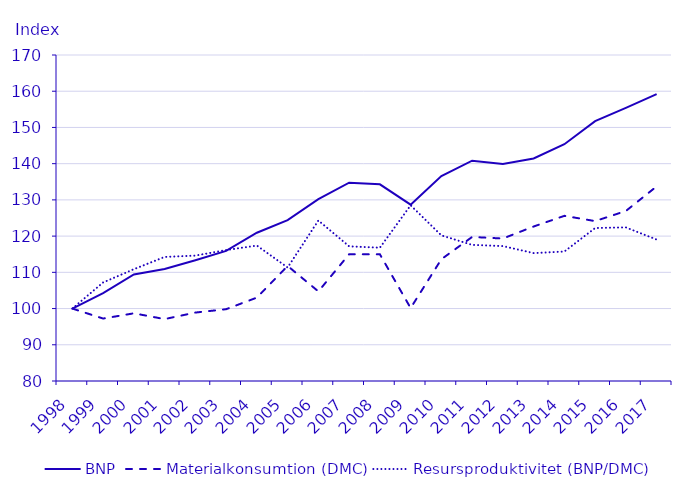
| Category | BNP | Materialkonsumtion (DMC) | Resursproduktivitet (BNP/DMC) |
|---|---|---|---|
| 1998.0 | 100 | 100 | 100 |
| 1999.0 | 104.249 | 97.241 | 107.207 |
| 2000.0 | 109.408 | 98.687 | 110.864 |
| 2001.0 | 110.926 | 97.091 | 114.249 |
| 2002.0 | 113.354 | 98.892 | 114.624 |
| 2003.0 | 115.933 | 99.823 | 116.139 |
| 2004.0 | 120.941 | 103.025 | 117.39 |
| 2005.0 | 124.431 | 111.764 | 111.333 |
| 2006.0 | 130.197 | 104.732 | 124.314 |
| 2007.0 | 134.75 | 114.99 | 117.183 |
| 2008.0 | 134.294 | 114.985 | 116.793 |
| 2009.0 | 128.68 | 100.134 | 128.507 |
| 2010.0 | 136.571 | 113.618 | 120.201 |
| 2011.0 | 140.819 | 119.768 | 117.577 |
| 2012.0 | 139.909 | 119.331 | 117.244 |
| 2013.0 | 141.426 | 122.65 | 115.309 |
| 2014.0 | 145.372 | 125.596 | 115.746 |
| 2015.0 | 151.745 | 124.146 | 122.231 |
| 2016.0 | 155.387 | 126.936 | 122.413 |
| 2017.0 | 159.181 | 133.722 | 119.038 |